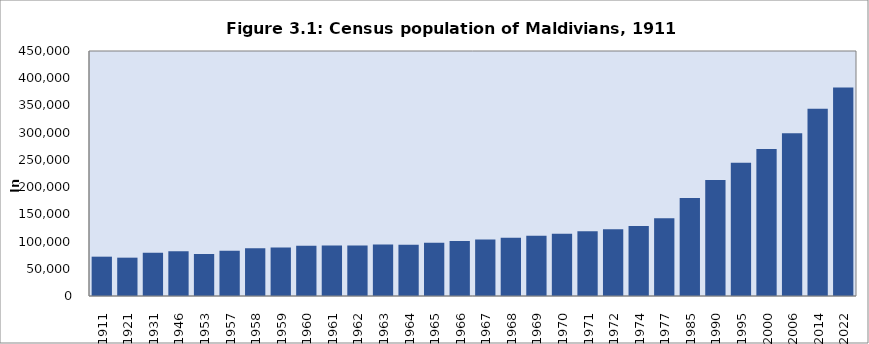
| Category | Series 0 |
|---|---|
| 1911 | 72237 |
|  1921 | 70413 |
|  1931 | 79281 |
|  1946 | 82068 |
|  1953 | 77273 |
|  1957 | 83075 |
|  1958 | 87582 |
|  1959 | 89290 |
|  1960 | 92247 |
|  1961 | 92793 |
|  1962 | 92744 |
|  1963 | 94527 |
|  1964 | 93960 |
|  1965 | 97743 |
|  1966 | 100883 |
|  1967 | 103801 |
|  1968 | 106969 |
|  1969 | 110770 |
|  1970 | 114469 |
|  1971 | 118818 |
|  1972 | 122673 |
|  1974 | 128697 |
|  1977 | 142832 |
|  1985 | 180088 |
|  1990 | 213215 |
| 1995 | 244814 |
| 2000 | 270101 |
| 2006 | 298968 |
| 2014 | 344023 |
| 2022 | 382751 |